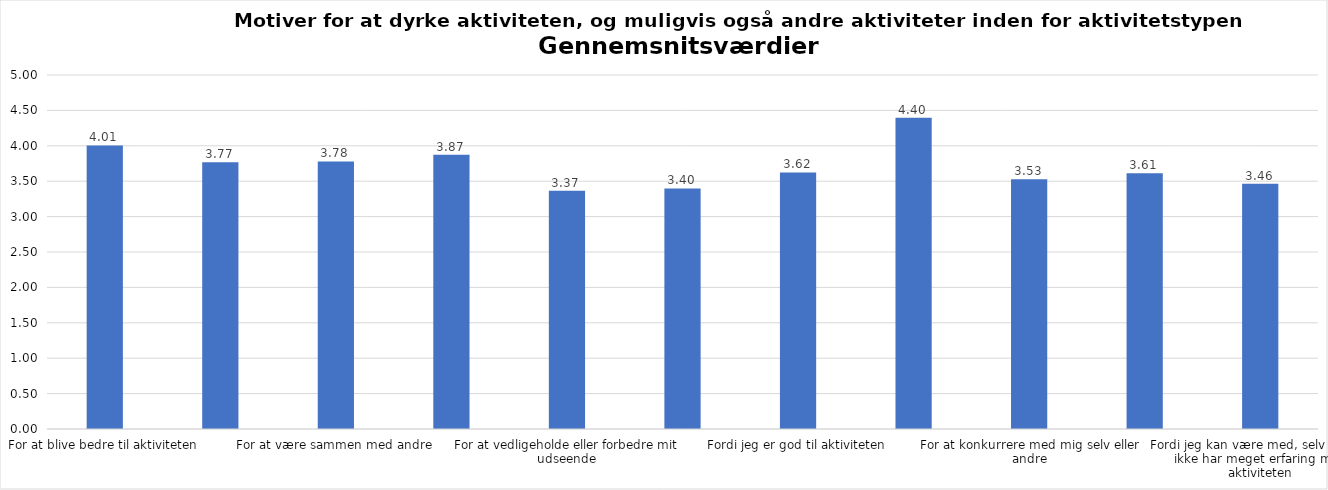
| Category | Gennemsnit |
|---|---|
| For at blive bedre til aktiviteten | 4.005 |
| For at vedligeholde eller forbedre min sundhed (fx helbred, fysisk form) | 3.769 |
| For at være sammen med andre | 3.779 |
| For at gøre noget godt for mig selv | 3.874 |
| For at vedligeholde eller forbedre mit udseende | 3.367 |
| Fordi andre i min omgangskreds opmuntrer mig til det | 3.397 |
| Fordi jeg er god til aktiviteten | 3.623 |
| Fordi jeg godt kan lide aktiviteten | 4.397 |
| For at konkurrere med mig selv eller andre | 3.528 |
| Fordi aktiviteten passer godt ind i min hverdag | 3.613 |
| Fordi jeg kan være med, selv om jeg ikke har meget erfaring med aktiviteten | 3.462 |